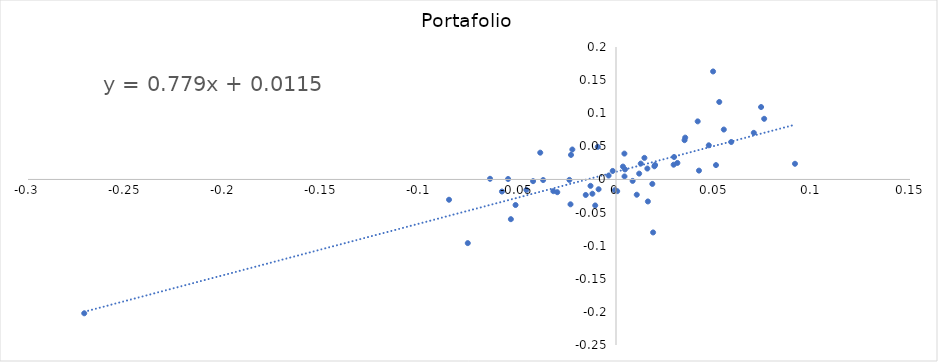
| Category | Portafolio |
|---|---|
| 0.07031166163327263 | 0.07 |
| -0.064260393167902 | 0.001 |
| 0.018926696361604822 | -0.08 |
| -0.010598264919067013 | -0.039 |
| -0.053634872916097365 | -0.06 |
| -0.0222767710313736 | 0.045 |
| -0.0005661213304670731 | -0.016 |
| -0.0851879520248251 | -0.031 |
| 0.03531174844753959 | 0.063 |
| 0.018531520052699424 | -0.007 |
| 0.05878698652869163 | 0.057 |
| 0.07402525378364677 | 0.109 |
| 0.004602363294843093 | 0.015 |
| -0.03717912426811287 | -0.001 |
| 0.015992139325808008 | 0.016 |
| -0.0037770907263284803 | 0.006 |
| 0.05500603873966159 | 0.075 |
| -0.029959860308075847 | -0.019 |
| 0.01994278586527054 | 0.022 |
| -0.05818986034726448 | -0.018 |
| 0.051015885604982714 | 0.022 |
| 0.0042835582386362425 | 0.039 |
| -0.022954466765379822 | 0.037 |
| 0.029631081722975683 | 0.034 |
| 0.004342381792751926 | 0.005 |
| 0.04953555856919967 | 0.163 |
| 0.01626976408147396 | -0.033 |
| 0.012625606671679446 | 0.024 |
| 0.0006075457178154053 | -0.018 |
| 0.003541864842437681 | 0.019 |
| -0.04231203614069057 | -0.003 |
| 0.014495500428196362 | 0.033 |
| 0.047341945572677124 | 0.052 |
| 0.029418954183595858 | 0.022 |
| -0.05124568406730934 | -0.039 |
| -0.015429572558224414 | -0.023 |
| 0.0756018467626689 | 0.092 |
| -0.012040420041390831 | -0.022 |
| 0.01958996838450644 | 0.02 |
| -0.03196555506940357 | -0.018 |
| 0.010592165596750913 | -0.023 |
| -0.023788380640017648 | -0.001 |
| -0.07562065508243299 | -0.096 |
| -0.009294775100920916 | 0.049 |
| -0.03865172123778304 | 0.04 |
| 0.09131703785267686 | 0.024 |
| 0.04233557473687122 | 0.013 |
| 0.052689505194693176 | 0.117 |
| -0.00888054719286524 | -0.015 |
| -0.05505706514831865 | 0.001 |
| 0.041681237390719605 | 0.088 |
| 0.008489457578535697 | -0.002 |
| -0.0016707956444086403 | 0.013 |
| 0.011824151020827012 | 0.009 |
| 0.03497553803645226 | 0.059 |
| -0.01299941830205431 | -0.01 |
| 0.0313290982182739 | 0.025 |
| -0.02321314709880784 | -0.038 |
| -0.04570675501745869 | -0.016 |
| -0.27131342724943686 | -0.202 |